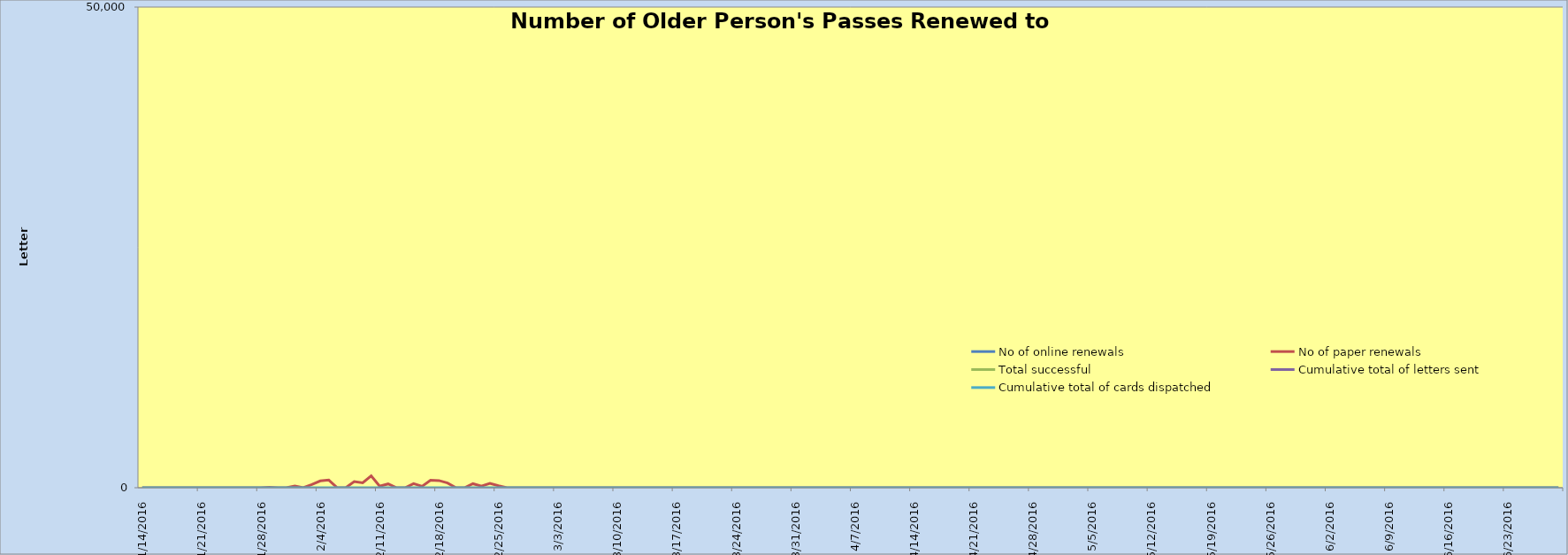
| Category | No of online renewals | No of paper renewals | Total successful | Cumulative total of letters sent  | Cumulative total of cards dispatched  |
|---|---|---|---|---|---|
| 1/14/16 |  | 0 |  |  | 0 |
| 1/15/16 |  | 0 |  |  | 0 |
| 1/16/16 |  | 0 |  |  | 0 |
| 1/17/16 |  | 0 |  |  | 0 |
| 1/18/16 |  | 0 |  |  | 0 |
| 1/19/16 |  | 0 |  |  | 0 |
| 1/20/16 |  | 0 |  |  | 0 |
| 1/21/16 |  | 0 |  |  | 0 |
| 1/22/16 |  | 0 |  |  | 0 |
| 1/23/16 |  | 0 |  |  | 0 |
| 1/24/16 |  | 0 |  |  | 0 |
| 1/25/16 |  | 0 |  |  | 0 |
| 1/26/16 |  | 6 |  |  | 0 |
| 1/27/16 |  | 1 |  |  | 0 |
| 1/28/16 |  | 2 |  |  | 0 |
| 1/29/16 |  | 50 |  |  | 0 |
| 1/30/16 |  | 0 |  |  | 0 |
| 1/31/16 |  | 0 |  |  | 0 |
| 2/1/16 |  | 178 |  |  | 0 |
| 2/2/16 |  | 0 |  |  | 0 |
| 2/3/16 |  | 334 |  |  | 0 |
| 2/4/16 |  | 705 |  |  | 0 |
| 2/5/16 |  | 794 |  |  | 0 |
| 2/6/16 |  | 0 |  |  | 0 |
| 2/7/16 |  | 0 |  |  | 0 |
| 2/8/16 |  | 644 |  |  | 0 |
| 2/9/16 |  | 508 |  |  | 0 |
| 2/10/16 |  | 1237 |  |  | 0 |
| 2/11/16 |  | 160 |  |  | 0 |
| 2/12/16 |  | 398 |  |  | 0 |
| 2/13/16 |  | 0 |  |  | 0 |
| 2/14/16 |  | 0 |  |  | 0 |
| 2/15/16 |  | 427 |  |  | 0 |
| 2/16/16 |  | 150 |  |  | 0 |
| 2/17/16 |  | 786 |  |  | 0 |
| 2/18/16 |  | 744 |  |  | 0 |
| 2/19/16 |  | 492 |  |  | 0 |
| 2/20/16 |  | 0 |  |  | 0 |
| 2/21/16 |  | 0 |  |  | 0 |
| 2/22/16 |  | 420 |  |  | 0 |
| 2/23/16 |  | 164 |  |  | 0 |
| 2/24/16 |  | 456 |  |  | 0 |
| 2/25/16 |  | 205 |  |  | 0 |
| 2/26/16 |  | 0 |  |  | 0 |
| 2/27/16 |  | 0 |  |  | 0 |
| 2/28/16 |  | 0 |  |  | 0 |
| 2/29/16 |  | 0 |  |  | 0 |
| 3/1/16 |  | 0 |  |  | 0 |
| 3/2/16 |  | 0 |  |  | 0 |
| 3/3/16 |  | 0 |  |  | 0 |
| 3/4/16 |  | 0 |  |  | 0 |
| 3/5/16 |  | 0 |  |  | 0 |
| 3/6/16 |  | 0 |  |  | 0 |
| 3/7/16 |  | 0 |  |  | 0 |
| 3/8/16 |  | 0 |  |  | 0 |
| 3/9/16 |  | 0 |  |  | 0 |
| 3/10/16 |  | 0 |  |  | 0 |
| 3/11/16 |  | 0 |  |  | 0 |
| 3/12/16 |  | 0 |  |  | 0 |
| 3/13/16 |  | 0 |  |  | 0 |
| 3/14/16 |  | 0 |  |  | 0 |
| 3/15/16 |  | 0 |  |  | 0 |
| 3/16/16 |  | 0 |  |  | 0 |
| 3/17/16 |  | 2 |  |  | 0 |
| 3/18/16 |  | 0 |  |  | 0 |
| 3/19/16 |  | 0 |  |  | 0 |
| 3/20/16 |  | 0 |  |  | 0 |
| 3/21/16 |  | 0 |  |  | 0 |
| 3/22/16 |  | 0 |  |  | 0 |
| 3/23/16 |  | 0 |  |  | 0 |
| 3/24/16 |  | 0 |  |  | 0 |
| 3/25/16 |  | 0 |  |  | 0 |
| 3/26/16 |  | 0 |  |  | 0 |
| 3/27/16 |  | 0 |  |  | 0 |
| 3/28/16 |  | 0 |  |  | 0 |
| 3/29/16 |  | 0 |  |  | 0 |
| 3/30/16 |  | 0 |  |  | 0 |
| 3/31/16 |  | 0 |  |  | 0 |
| 4/1/16 |  | 0 |  |  | 0 |
| 4/2/16 |  | 0 |  |  | 0 |
| 4/3/16 |  | 0 |  |  | 0 |
| 4/4/16 |  | 0 |  |  | 0 |
| 4/5/16 |  | 0 |  |  | 0 |
| 4/6/16 |  | 0 |  |  | 0 |
| 4/7/16 |  | 0 |  |  | 0 |
| 4/8/16 |  | 0 |  |  | 0 |
| 4/9/16 |  | 0 |  |  | 0 |
| 4/10/16 |  | 0 |  |  | 0 |
| 4/11/16 |  | 0 |  |  | 0 |
| 4/12/16 |  | 0 |  |  | 0 |
| 4/13/16 |  | 0 |  |  | 0 |
| 4/14/16 |  | 0 |  |  | 0 |
| 4/15/16 |  | 0 |  |  | 0 |
| 4/16/16 |  | 0 |  |  | 0 |
| 4/17/16 |  | 0 |  |  | 0 |
| 4/18/16 |  | 0 |  |  | 0 |
| 4/19/16 |  | 0 |  |  | 0 |
| 4/20/16 |  | 0 |  |  | 0 |
| 4/21/16 |  | 0 |  |  | 0 |
| 4/22/16 |  | 0 |  |  | 0 |
| 4/23/16 |  | 0 |  |  | 0 |
| 4/24/16 |  | 0 |  |  | 0 |
| 4/25/16 |  | 0 |  |  | 0 |
| 4/26/16 |  | 0 |  |  | 0 |
| 4/27/16 |  | 0 |  |  | 0 |
| 4/28/16 |  | 0 |  |  | 0 |
| 4/29/16 |  | 0 |  |  | 0 |
| 4/30/16 |  | 0 |  |  | 0 |
| 5/1/16 |  | 0 |  |  | 0 |
| 5/2/16 |  | 0 |  |  | 0 |
| 5/3/16 |  | 0 |  |  | 0 |
| 5/4/16 |  | 0 |  |  | 0 |
| 5/5/16 |  | 0 |  |  | 0 |
| 5/6/16 |  | 0 |  |  | 0 |
| 5/7/16 |  | 0 |  |  | 0 |
| 5/8/16 |  | 0 |  |  | 0 |
| 5/9/16 |  | 0 |  |  | 0 |
| 5/10/16 |  | 0 |  |  | 0 |
| 5/11/16 |  | 0 |  |  | 0 |
| 5/12/16 |  | 0 |  |  | 0 |
| 5/13/16 |  | 0 |  |  | 0 |
| 5/14/16 |  | 0 |  |  | 0 |
| 5/15/16 |  | 0 |  |  | 0 |
| 5/16/16 |  | 0 |  |  | 0 |
| 5/17/16 |  | 0 |  |  | 0 |
| 5/18/16 |  | 0 |  |  | 0 |
| 5/19/16 |  | 0 |  |  | 0 |
| 5/20/16 |  | 0 |  |  | 0 |
| 5/21/16 |  | 0 |  |  | 0 |
| 5/22/16 |  | 0 |  |  | 0 |
| 5/23/16 |  | 0 |  |  | 0 |
| 5/24/16 |  | 0 |  |  | 0 |
| 5/25/16 |  | 0 |  |  | 0 |
| 5/26/16 |  | 0 |  |  | 0 |
| 5/27/16 |  | 0 |  |  | 0 |
| 5/28/16 |  | 0 |  |  | 0 |
| 5/29/16 |  | 0 |  |  | 0 |
| 5/30/16 |  | 0 |  |  | 0 |
| 5/31/16 |  | 0 |  |  | 0 |
| 6/1/16 |  | 0 |  |  | 0 |
| 6/2/16 |  | 0 |  |  | 0 |
| 6/3/16 |  | 0 |  |  | 0 |
| 6/4/16 |  | 0 |  |  | 0 |
| 6/5/16 |  | 0 |  |  | 0 |
| 6/6/16 |  | 0 |  |  | 0 |
| 6/7/16 |  | 0 |  |  | 0 |
| 6/8/16 |  | 0 |  |  | 0 |
| 6/9/16 |  | 0 |  |  | 0 |
| 6/10/16 |  | 0 |  |  | 0 |
| 6/11/16 |  | 0 |  |  | 0 |
| 6/12/16 |  | 0 |  |  | 0 |
| 6/13/16 |  | 0 |  |  | 0 |
| 6/14/16 |  | 0 |  |  | 0 |
| 6/15/16 |  | 0 |  |  | 0 |
| 6/16/16 |  | 0 |  |  | 0 |
| 6/17/16 |  | 0 |  |  | 0 |
| 6/18/16 |  | 0 |  |  | 0 |
| 6/19/16 |  | 0 |  |  | 0 |
| 6/20/16 |  | 0 |  |  | 0 |
| 6/21/16 |  | 0 |  |  | 0 |
| 6/22/16 |  | 0 |  |  | 0 |
| 6/23/16 |  | 0 |  |  | 0 |
| 6/24/16 |  | 0 |  |  | 0 |
| 6/25/16 |  | 0 |  |  | 0 |
| 6/26/16 |  | 0 |  |  | 0 |
| 6/27/16 |  | 0 |  |  | 0 |
| 6/28/16 |  | 0 |  |  | 0 |
| 6/29/16 |  | 0 |  |  | 0 |